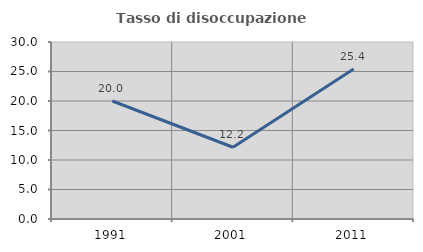
| Category | Tasso di disoccupazione giovanile  |
|---|---|
| 1991.0 | 20 |
| 2001.0 | 12.162 |
| 2011.0 | 25.424 |